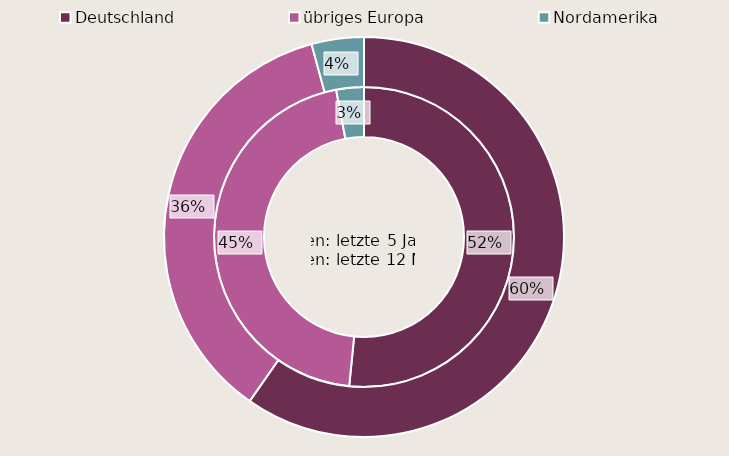
| Category | letzte 5 Jahre | letzte 12 Monate |
|---|---|---|
| Deutschland | 1445119846.698 | 0.597 |
| übriges Europa | 1273312992.552 | 0.361 |
| Nordamerika | 83467085.864 | 0.042 |